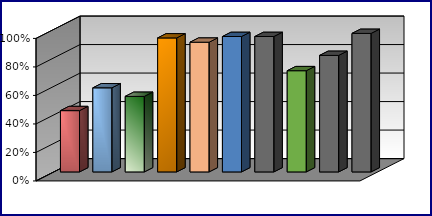
| Category | Series 0 | Series 1 | Series 2 | Series 3 |
|---|---|---|---|---|
| 0 | 0.43 |  |  |  |
| 1 | 0.59 |  |  |  |
| 2 | 0.53 |  |  |  |
| 3 | 0.94 |  |  |  |
| 4 | 0.91 |  |  |  |
| 5 | 0.95 |  |  |  |
| 6 | 0.95 |  |  |  |
| 7 | 0.71 |  |  |  |
| 8 | 0.818 |  |  |  |
| 9 | 0.972 |  |  |  |